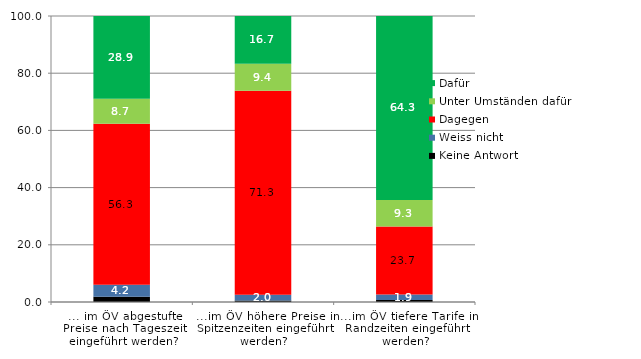
| Category | Keine Antwort | Weiss nicht | Dagegen | Unter Umständen dafür | Dafür |
|---|---|---|---|---|---|
| ... im ÖV abgestufte Preise nach Tageszeit eingeführt werden? | 1.806 | 4.245 | 56.3 | 8.731 | 28.918 |
| ...im ÖV höhere Preise in Spitzenzeiten eingeführt werden? | 0.526 | 2.022 | 71.322 | 9.426 | 16.704 |
| ...im ÖV tiefere Tarife in Randzeiten eingeführt werden? | 0.713 | 1.938 | 23.743 | 9.288 | 64.318 |